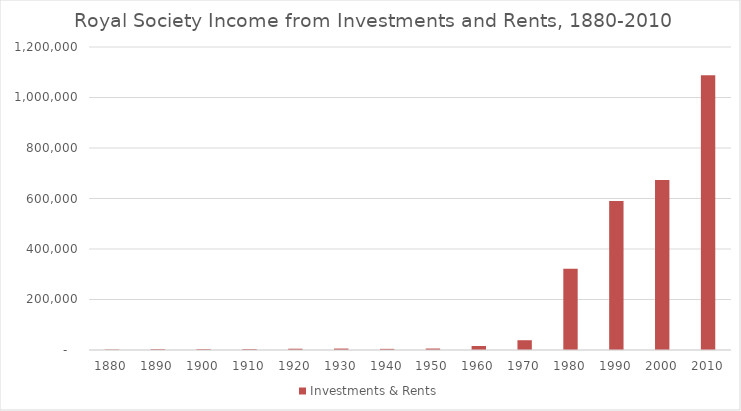
| Category | Investments & Rents |
|---|---|
| 1880.0 | 1934.379 |
| 1890.0 | 3310.146 |
| 1900.0 | 3339.783 |
| 1910.0 | 3548.983 |
| 1920.0 | 5088.746 |
| 1930.0 | 5752.842 |
| 1940.0 | 4524.579 |
| 1950.0 | 5814.675 |
| 1960.0 | 15854 |
| 1970.0 | 38728 |
| 1980.0 | 321817 |
| 1990.0 | 590511 |
| 2000.0 | 673000 |
| 2010.0 | 1088000 |